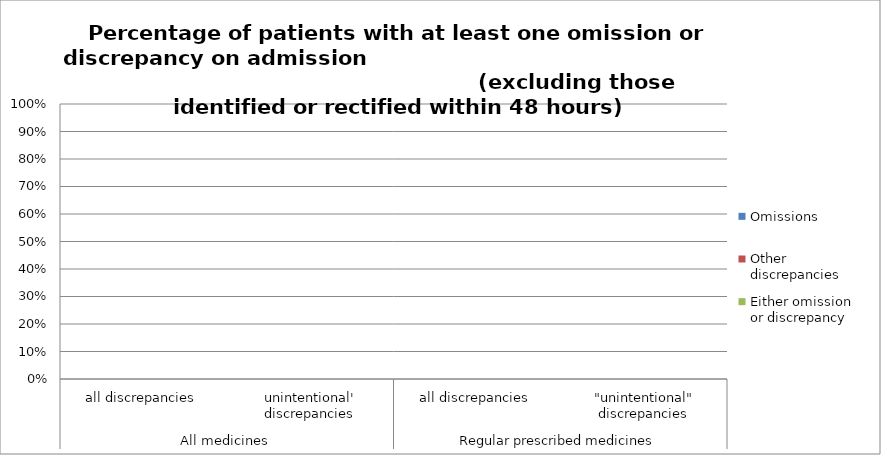
| Category | Omissions | Other discrepancies | Either omission or discrepancy |
|---|---|---|---|
| 0 | 0 | 0 | 0 |
| 1 | 0 | 0 | 0 |
| 2 | 0 | 0 | 0 |
| 3 | 0 | 0 | 0 |